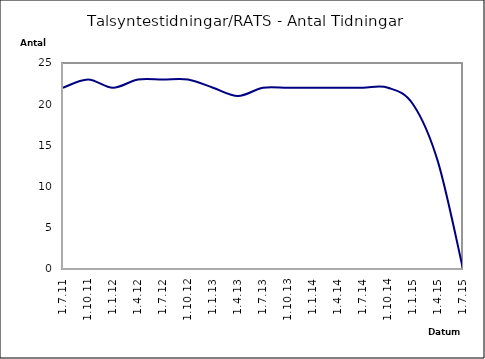
| Category | Series 0 |
|---|---|
| 1.7.11 | 22 |
| 1.10.11 | 23 |
| 1.1.12 | 22 |
| 1.4.12 | 23 |
| 1.7.12 | 23 |
| 1.10.12 | 23 |
| 1.1.13 | 22 |
| 1.4.13 | 21 |
| 1.7.13 | 22 |
| 1.10.13 | 22 |
| 1.1.14 | 22 |
| 1.4.14 | 22 |
| 1.7.14 | 22 |
| 1.10.14 | 22 |
| 1.1.15 | 20 |
| 1.4.15 | 13 |
| 1.7.15 | 0 |